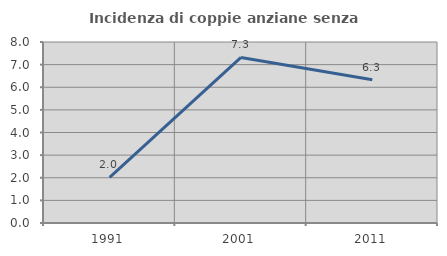
| Category | Incidenza di coppie anziane senza figli  |
|---|---|
| 1991.0 | 2.02 |
| 2001.0 | 7.317 |
| 2011.0 | 6.329 |